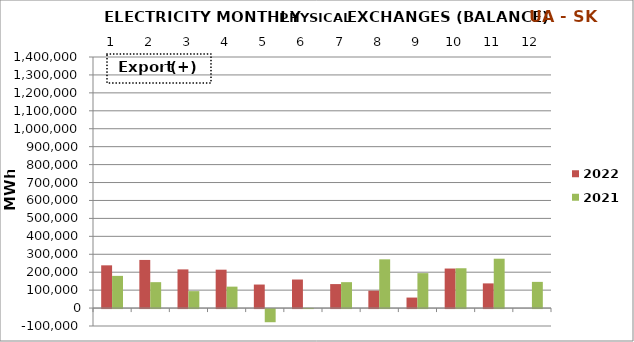
| Category | 2022 | 2021 |
|---|---|---|
| 0 | 238326.25 | 179494.95 |
| 1 | 268399.825 | 144439.5 |
| 2 | 215617.925 | 94460.475 |
| 3 | 214019.225 | 119487.725 |
| 4 | 131185.95 | -73347.325 |
| 5 | 159177.25 | 858.45 |
| 6 | 133737.8 | 144461.875 |
| 7 | 96990.575 | 271728.05 |
| 8 | 58556.625 | 194809.65 |
| 9 | 220427.7 | 222017.475 |
| 10 | 137593.25 | 275236.05 |
| 11 | 0 | 146070 |